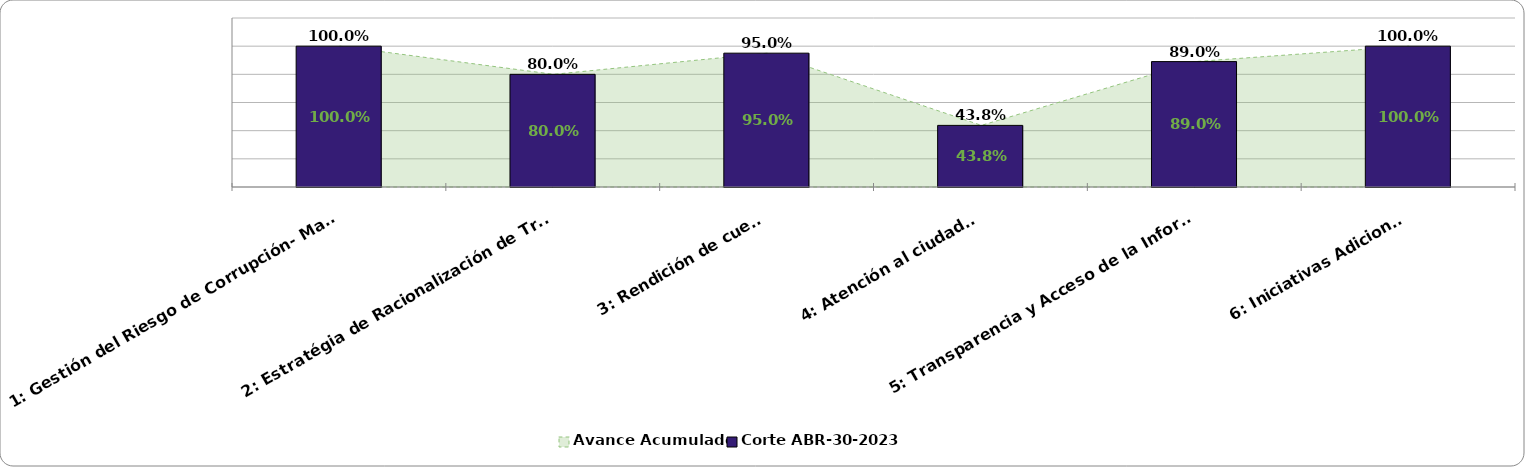
| Category | Corte ABR-30-2023 |
|---|---|
| 1: Gestión del Riesgo de Corrupción- Mapa de Riesgos de Corrupción | 1 |
| 2: Estratégia de Racionalización de Trámites | 0.8 |
| 3: Rendición de cuentas | 0.95 |
| 4: Atención al ciudadano | 0.438 |
| 5: Transparencia y Acceso de la Información | 0.89 |
| 6: Iniciativas Adicionales  | 1 |